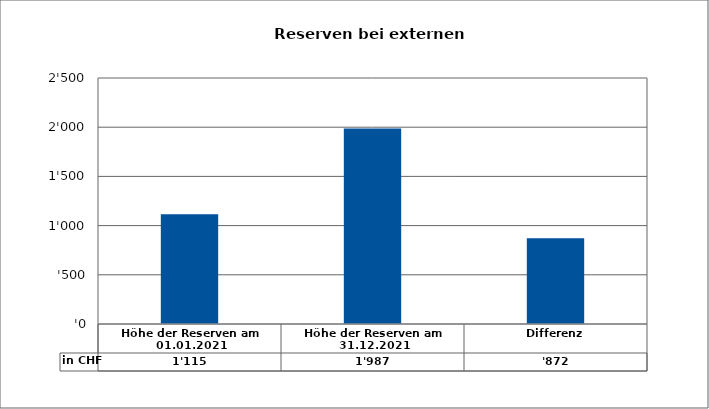
| Category | in CHF |
|---|---|
| Höhe der Reserven am 01.01.2021 | 1115 |
| Höhe der Reserven am 31.12.2021 | 1986.73 |
| Differenz | 871.73 |